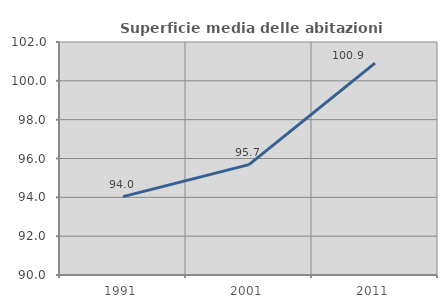
| Category | Superficie media delle abitazioni occupate |
|---|---|
| 1991.0 | 94.037 |
| 2001.0 | 95.684 |
| 2011.0 | 100.915 |